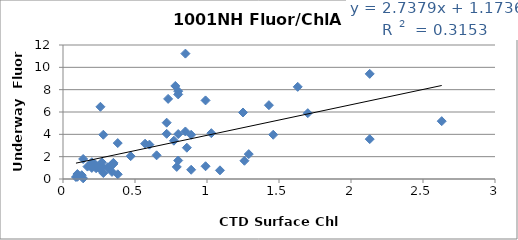
| Category | Series 0 |
|---|---|
| 0.34 | 0.636 |
| 0.89 | 0.827 |
| 1.09 | 0.777 |
| 0.28 | 0.536 |
| 0.23 | 0.965 |
| 0.34 | 1.27 |
| 0.31 | 1.052 |
| 0.27 | 1.493 |
| 0.38 | 0.421 |
| 0.14 | 0.058 |
| 0.1 | 0.198 |
| 0.09 | 0.176 |
| 0.13 | 0.34 |
| 0.1 | 0.444 |
| 0.14 | 1.793 |
| 0.26 | 0.915 |
| 0.27 | 1.11 |
| 0.22 | 1.361 |
| 0.28 | 3.963 |
| 0.34 | 1.297 |
| 0.38 | 3.217 |
| 0.77 | 3.429 |
| 0.8 | 4.025 |
| 0.99 | 1.143 |
| 0.35 | 1.348 |
| 0.65 | 2.12 |
| 0.47 | 2.047 |
| 0.25 | 0.988 |
| 0.2 | 0.992 |
| 0.17 | 1.11 |
| 0.2 | 1.501 |
| 0.26 | 6.466 |
| 0.72 | 5.043 |
| 0.89 | 3.958 |
| 2.13 | 3.572 |
| 0.8 | 1.656 |
| 0.79 | 1.083 |
| 0.85 | 4.256 |
| 1.29 | 2.23 |
| 1.26 | 1.634 |
| 0.6 | 3.076 |
| 0.72 | 4.046 |
| 0.73 | 7.174 |
| 0.86 | 2.802 |
| 0.35 | 1.448 |
| 0.32 | 0.97 |
| 1.03 | 4.103 |
| 1.7 | 5.896 |
| 1.46 | 3.963 |
| 1.43 | 6.611 |
| 1.63 | 8.252 |
| 2.63 | 5.179 |
| 0.99 | 7.038 |
| 1.25 | 5.956 |
| 0.78 | 8.333 |
| 0.8 | 7.575 |
| 0.57 | 3.162 |
| 0.85 | 11.229 |
| 0.8 | 7.865 |
| 2.13 | 9.413 |